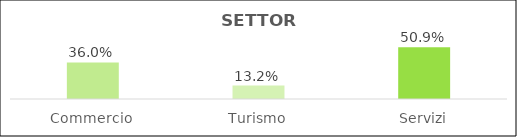
| Category | Series 0 |
|---|---|
| Commercio | 0.36 |
| Turismo | 0.132 |
| Servizi | 0.509 |